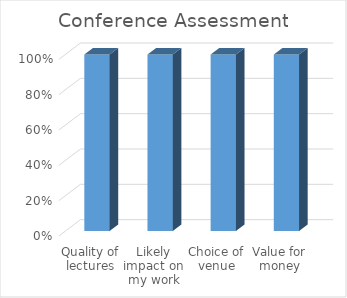
| Category | Series 0 |
|---|---|
| Quality of lectures | 4.5 |
| Likely impact on my work | 4.4 |
| Choice of venue | 4.8 |
| Value for money | 4.2 |